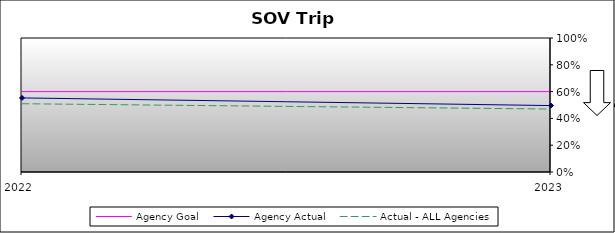
| Category | Agency Goal | Agency Actual | Actual - ALL Agencies |
|---|---|---|---|
| 2022.0 | 0.6 | 0.553 | 0.509 |
| 2023.0 | 0.6 | 0.496 | 0.47 |